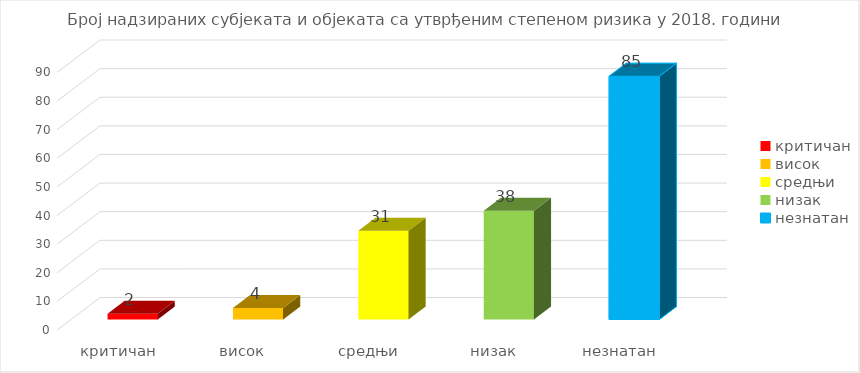
| Category | Series 0 |
|---|---|
| критичан | 2 |
| висок | 4 |
| средњи | 31 |
| низак | 38 |
| незнатан | 85 |